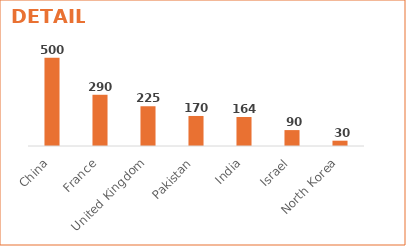
| Category | WARHEADS |
|---|---|
| China | 500 |
| France | 290 |
| United Kingdom | 225 |
| Pakistan | 170 |
| India | 164 |
| Israel | 90 |
| North Korea | 30 |